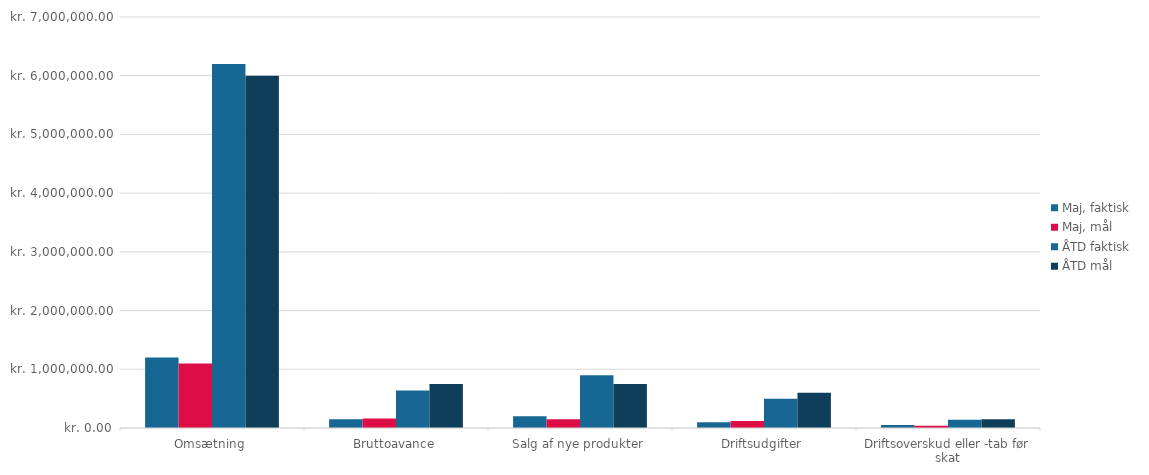
| Category | Maj, faktisk | Maj, mål | ÅTD faktisk | ÅTD mål |
|---|---|---|---|---|
| Omsætning | 1200000 | 1100000 | 6200000 | 6000000 |
| Bruttoavance | 150000 | 160000 | 640000 | 750000 |
| Salg af nye produkter | 200000 | 150000 | 900000 | 750000 |
| Driftsudgifter | 100000 | 120000 | 500000 | 600000 |
| Driftsoverskud eller -tab før skat | 50000 | 40000 | 140000 | 150000 |